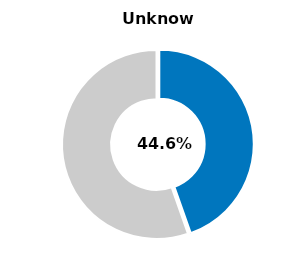
| Category | Series 0 |
|---|---|
| Unknown | 0.446 |
| Other | 0.554 |